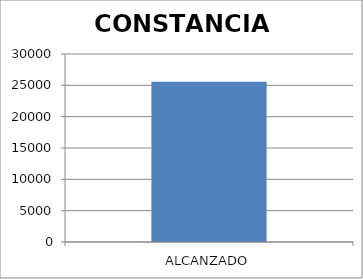
| Category | CONSTANCIAS  |
|---|---|
| ALCANZADO | 25557 |